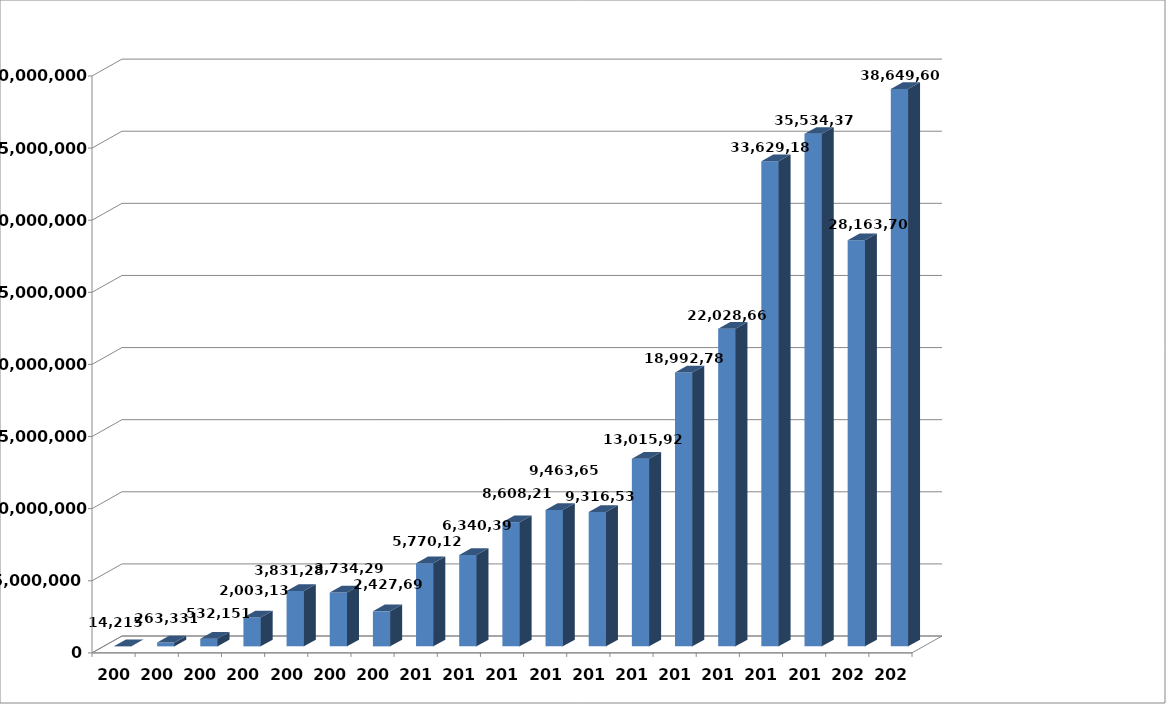
| Category | Series 0 |
|---|---|
| 2003.0 | 14215 |
| 2004.0 | 263331 |
| 2005.0 | 532151 |
| 2006.0 | 2003133 |
| 2007.0 | 3831280 |
| 2008.0 | 3734298 |
| 2009.0 | 2427693 |
| 2010.0 | 5770125 |
| 2011.0 | 6340394 |
| 2012.0 | 8608214 |
| 2013.0 | 9463650 |
| 2014.0 | 9316538 |
| 2015.0 | 13015921 |
| 2016.0 | 18992788 |
| 2017.0 | 22028666 |
| 2018.0 | 33629188 |
| 2019.0 | 35534374 |
| 2020.0 | 28163703 |
| 2021.0 | 38649607 |